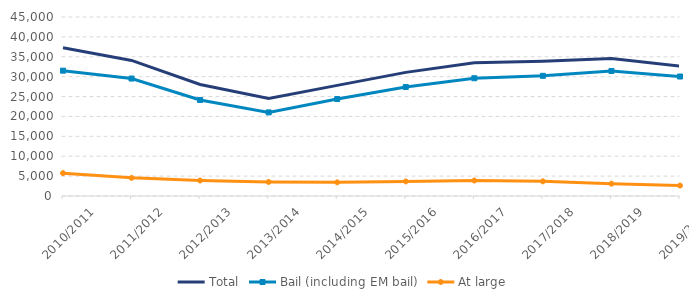
| Category | Total | Bail (including EM bail) | At large |
|---|---|---|---|
| 2010/2011 | 37256 | 31509 | 5747 |
| 2011/2012 | 34089 | 29528 | 4561 |
| 2012/2013 | 28028 | 24132 | 3896 |
| 2013/2014 | 24546 | 21018 | 3528 |
| 2014/2015 | 27810 | 24375 | 3435 |
| 2015/2016 | 31080 | 27412 | 3668 |
| 2016/2017 | 33502 | 29607 | 3895 |
| 2017/2018 | 33902 | 30212 | 3690 |
| 2018/2019 | 34545 | 31438 | 3107 |
| 2019/2020 | 32658 | 30037 | 2621 |